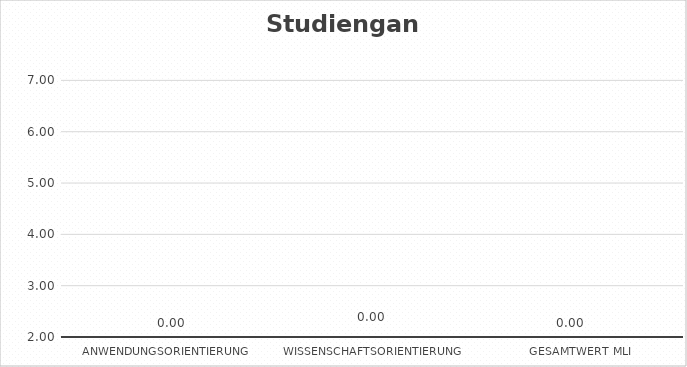
| Category | Series 2 |
|---|---|
| Anwendungsorientierung | 0 |
| Wissenschaftsorientierung | 0 |
| Gesamtwert MLI | 0 |